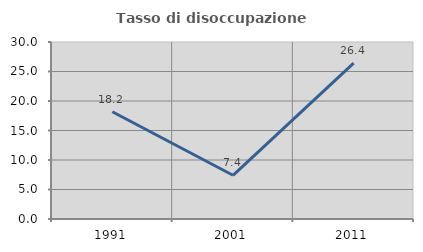
| Category | Tasso di disoccupazione giovanile  |
|---|---|
| 1991.0 | 18.182 |
| 2001.0 | 7.407 |
| 2011.0 | 26.415 |